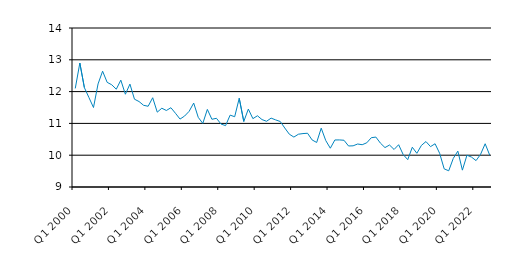
| Category | Series 0 |
|---|---|
| Q1 2000 | 12.1 |
| Q2 2000 | 12.899 |
| Q3 2000 | 12.125 |
| Q4 2000 | 11.812 |
| Q1 2001 | 11.5 |
| Q2 2001 | 12.241 |
| Q3 2001 | 12.642 |
| Q4 2001 | 12.291 |
| Q1 2002 | 12.215 |
| Q2 2002 | 12.075 |
| Q3 2002 | 12.36 |
| Q4 2002 | 11.917 |
| Q1 2003 | 12.236 |
| Q2 2003 | 11.761 |
| Q3 2003 | 11.688 |
| Q4 2003 | 11.569 |
| Q1 2004 | 11.539 |
| Q2 2004 | 11.807 |
| Q3 2004 | 11.354 |
| Q4 2004 | 11.477 |
| Q1 2005 | 11.406 |
| Q2 2005 | 11.493 |
| Q3 2005 | 11.318 |
| Q4 2005 | 11.136 |
| Q1 2006 | 11.231 |
| Q2 2006 | 11.38 |
| Q3 2006 | 11.64 |
| Q4 2006 | 11.19 |
| Q1 2007 | 11 |
| Q2 2007 | 11.44 |
| Q3 2007 | 11.13 |
| Q4 2007 | 11.16 |
| Q1 2008 | 10.98 |
| Q2 2008 | 10.93 |
| Q3 2008 | 11.26 |
| Q4 2008 | 11.21 |
| Q1 2009 | 11.79 |
| Q2 2009 | 11.06 |
| Q3 2009 | 11.45 |
| Q4 2009 | 11.15 |
| Q1 2010 | 11.24 |
| Q2 2010 | 11.12 |
| Q3 2010 | 11.067 |
| Q4 2010 | 11.166 |
| Q1 2011 | 11.11 |
| Q2 2011 | 11.06 |
| Q3 2011 | 10.855 |
| Q4 2011 | 10.66 |
| Q1 2012 | 10.57 |
| Q2 2012 | 10.66 |
| Q3 2012 | 10.68 |
| Q4 2012 | 10.69 |
| Q1 2013 | 10.48 |
| Q2 2013 | 10.4 |
| Q3 2013 | 10.85 |
| Q4 2013 | 10.46 |
| Q1 2014 | 10.22 |
| Q2 2014 | 10.479 |
| Q3 2014 | 10.48 |
| Q4 2014 | 10.47 |
| Q1 2015 | 10.29 |
| Q2 2015 | 10.295 |
| Q3 2015 | 10.352 |
| Q4 2015 | 10.33 |
| Q1 2016 | 10.39 |
| Q2 2016 | 10.55 |
| Q3 2016 | 10.57 |
| Q4 2016 | 10.38 |
| Q1 2017 | 10.24 |
| Q2 2017 | 10.32 |
| Q3 2017 | 10.18 |
| Q4 2017 | 10.33 |
| Q1 2018 | 10.02 |
| Q2 2018 | 9.86 |
| Q3 2018 | 10.251 |
| Q4 2018 | 10.06 |
| Q1 2019 | 10.308 |
| Q2 2019 | 10.429 |
| Q3 2019 | 10.27 |
| Q4 2019 | 10.36 |
| Q1 2020 | 10.06 |
| Q2 2020 | 9.57 |
| Q3 2020 | 9.51 |
| Q4 2020 | 9.9 |
| Q1 2021 | 10.128 |
| Q2 2021 | 9.53 |
| Q3 2021 | 10 |
| Q4 2021 | 9.94 |
| Q1 2022 | 9.83 |
| Q2 2022 | 10.03 |
| Q3 2022 | 10.36 |
| Q4 2022 | 10 |